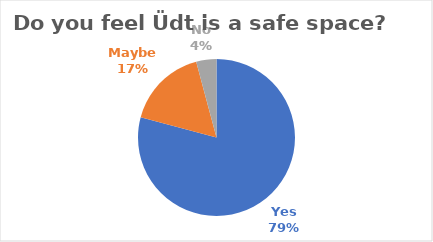
| Category | Number  |
|---|---|
| Yes | 57 |
| Maybe | 12 |
| No | 3 |